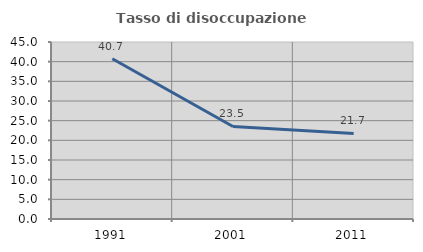
| Category | Tasso di disoccupazione giovanile  |
|---|---|
| 1991.0 | 40.741 |
| 2001.0 | 23.529 |
| 2011.0 | 21.739 |